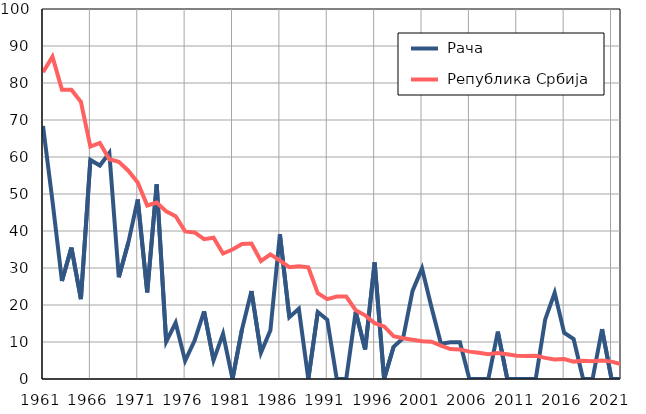
| Category |  Рача |  Република Србија |
|---|---|---|
| 1961.0 | 68.4 | 82.9 |
| 1962.0 | 48.1 | 87.1 |
| 1963.0 | 26.5 | 78.2 |
| 1964.0 | 35.5 | 78.2 |
| 1965.0 | 21.6 | 74.9 |
| 1966.0 | 59.2 | 62.8 |
| 1967.0 | 57.7 | 63.8 |
| 1968.0 | 61.1 | 59.4 |
| 1969.0 | 27.5 | 58.7 |
| 1970.0 | 36.8 | 56.3 |
| 1971.0 | 48.5 | 53.1 |
| 1972.0 | 23.4 | 46.9 |
| 1973.0 | 52.6 | 47.7 |
| 1974.0 | 10.1 | 45.3 |
| 1975.0 | 15.2 | 44 |
| 1976.0 | 4.9 | 39.9 |
| 1977.0 | 10.4 | 39.6 |
| 1978.0 | 18.3 | 37.8 |
| 1979.0 | 5.1 | 38.2 |
| 1980.0 | 12.2 | 33.9 |
| 1981.0 | 0 | 35 |
| 1982.0 | 13.4 | 36.5 |
| 1983.0 | 23.8 | 36.6 |
| 1984.0 | 7.1 | 31.9 |
| 1985.0 | 13.2 | 33.7 |
| 1986.0 | 39.1 | 32 |
| 1987.0 | 16.7 | 30.2 |
| 1988.0 | 19 | 30.5 |
| 1989.0 | 0 | 30.2 |
| 1990.0 | 18.1 | 23.2 |
| 1991.0 | 16 | 21.6 |
| 1992.0 | 0 | 22.3 |
| 1993.0 | 0 | 22.3 |
| 1994.0 | 18.2 | 18.6 |
| 1995.0 | 8 | 17.2 |
| 1996.0 | 31.5 | 15.1 |
| 1997.0 | 0 | 14.2 |
| 1998.0 | 8.7 | 11.6 |
| 1999.0 | 11 | 11 |
| 2000.0 | 23.8 | 10.6 |
| 2001.0 | 29.9 | 10.2 |
| 2002.0 | 19.4 | 10.1 |
| 2003.0 | 9.5 | 9 |
| 2004.0 | 9.9 | 8.1 |
| 2005.0 | 9.9 | 8 |
| 2006.0 | 0 | 7.4 |
| 2007.0 | 0 | 7.1 |
| 2008.0 | 0 | 6.7 |
| 2009.0 | 12.8 | 7 |
| 2010.0 | 0 | 6.7 |
| 2011.0 | 0 | 6.3 |
| 2012.0 | 0 | 6.2 |
| 2013.0 | 0 | 6.3 |
| 2014.0 | 16.1 | 5.7 |
| 2015.0 | 23.3 | 5.3 |
| 2016.0 | 12.5 | 5.4 |
| 2017.0 | 10.8 | 4.7 |
| 2018.0 | 0 | 4.9 |
| 2019.0 | 0 | 4.8 |
| 2020.0 | 13.5 | 5 |
| 2021.0 | 0 | 4.7 |
| 2022.0 | 0 | 4 |